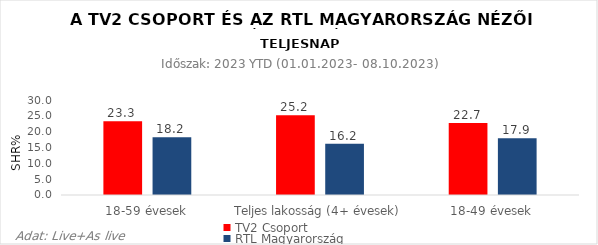
| Category | TV2 Csoport | RTL Magyarország |
|---|---|---|
| 18-59 évesek | 23.3 | 18.2 |
| Teljes lakosság (4+ évesek) | 25.2 | 16.2 |
| 18-49 évesek | 22.7 | 17.9 |